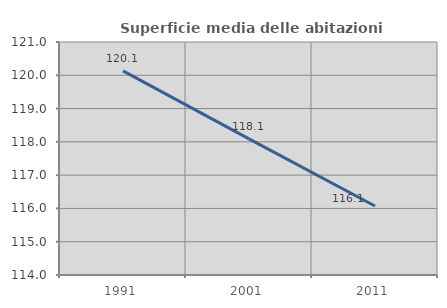
| Category | Superficie media delle abitazioni occupate |
|---|---|
| 1991.0 | 120.135 |
| 2001.0 | 118.09 |
| 2011.0 | 116.072 |